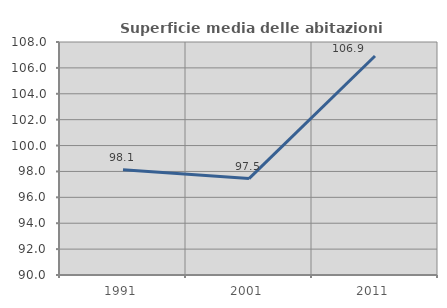
| Category | Superficie media delle abitazioni occupate |
|---|---|
| 1991.0 | 98.135 |
| 2001.0 | 97.45 |
| 2011.0 | 106.917 |